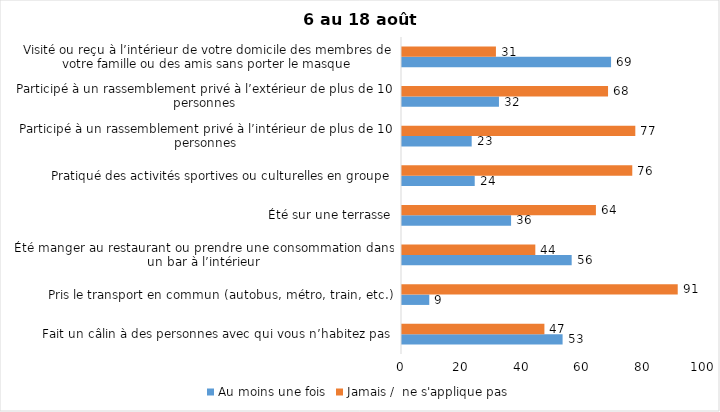
| Category | Au moins une fois | Jamais /  ne s'applique pas |
|---|---|---|
| Fait un câlin à des personnes avec qui vous n’habitez pas | 53 | 47 |
| Pris le transport en commun (autobus, métro, train, etc.) | 9 | 91 |
| Été manger au restaurant ou prendre une consommation dans un bar à l’intérieur | 56 | 44 |
| Été sur une terrasse | 36 | 64 |
| Pratiqué des activités sportives ou culturelles en groupe | 24 | 76 |
| Participé à un rassemblement privé à l’intérieur de plus de 10 personnes | 23 | 77 |
| Participé à un rassemblement privé à l’extérieur de plus de 10 personnes | 32 | 68 |
| Visité ou reçu à l’intérieur de votre domicile des membres de votre famille ou des amis sans porter le masque | 69 | 31 |